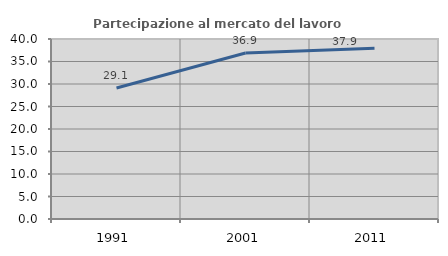
| Category | Partecipazione al mercato del lavoro  femminile |
|---|---|
| 1991.0 | 29.115 |
| 2001.0 | 36.879 |
| 2011.0 | 37.938 |